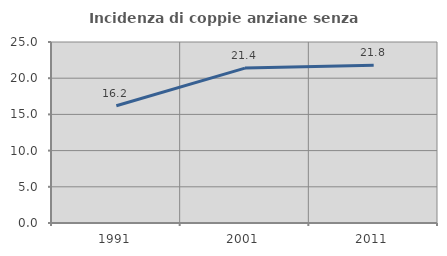
| Category | Incidenza di coppie anziane senza figli  |
|---|---|
| 1991.0 | 16.198 |
| 2001.0 | 21.393 |
| 2011.0 | 21.787 |